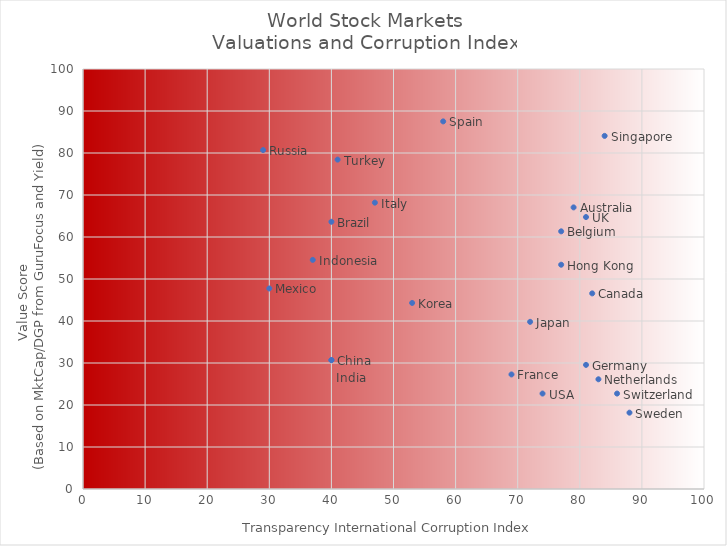
| Category | Corruption Index |
|---|---|
| 58.0 | 87.525 |
| 84.0 | 84.075 |
| 29.0 | 80.7 |
| 41.0 | 78.425 |
| 47.0 | 68.175 |
| 79.0 | 67.05 |
| 81.0 | 64.75 |
| 40.0 | 63.625 |
| 77.0 | 61.35 |
| 37.0 | 54.55 |
| 77.0 | 53.4 |
| 30.0 | 47.75 |
| 82.0 | 46.575 |
| 53.0 | 44.3 |
| 72.0 | 39.8 |
| 40.0 | 30.7 |
| 40.0 | 30.675 |
| 81.0 | 29.55 |
| 69.0 | 27.275 |
| 83.0 | 26.125 |
| 86.0 | 22.725 |
| 74.0 | 22.725 |
| 88.0 | 18.175 |